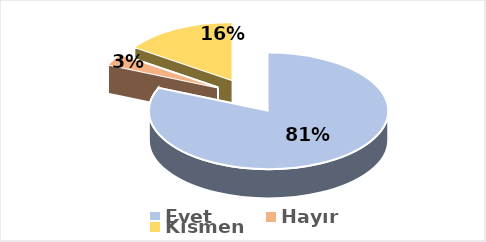
| Category | Evet |
|---|---|
| Evet | 0.815 |
| Hayır | 0.032 |
| Kısmen | 0.153 |